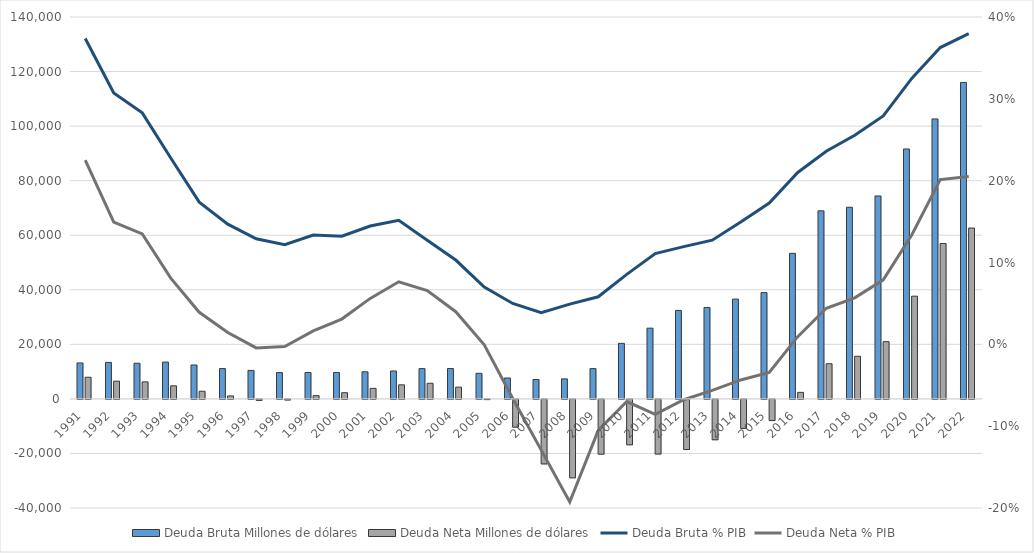
| Category | Deuda Bruta | Deuda Neta |
|---|---|---|
| 1991.0 | 13170 | 7929 |
| 1992.0 | 13385 | 6505 |
| 1993.0 | 13075 | 6238 |
| 1994.0 | 13498 | 4796 |
| 1995.0 | 12435 | 2803 |
| 1996.0 | 11117 | 1099 |
| 1997.0 | 10445 | -352 |
| 1998.0 | 9651 | -219 |
| 1999.0 | 9677 | 1186 |
| 2000.0 | 9690 | 2264 |
| 2001.0 | 9929 | 3856 |
| 2002.0 | 10228 | 5153 |
| 2003.0 | 11095 | 5727 |
| 2004.0 | 11126 | 4305 |
| 2005.0 | 9373 | -72 |
| 2006.0 | 7666 | -10176 |
| 2007.0 | 7094 | -23649 |
| 2008.0 | 7335 | -28745 |
| 2009.0 | 11096 | -20089 |
| 2010.0 | 20358 | -16651 |
| 2011.0 | 25928 | -20031 |
| 2012.0 | 32423 | -18387 |
| 2013.0 | 33515 | -14803 |
| 2014.0 | 36587 | -10642 |
| 2015.0 | 38963 | -7758 |
| 2016.0 | 53365 | 2390 |
| 2017.0 | 68936 | 12887 |
| 2018.0 | 70247 | 15629 |
| 2019.0 | 74391.192 | 20989.49 |
| 2020.0 | 91625.136 | 37655.193 |
| 2021.0 | 102631.904 | 56961.433 |
| 2022.0 | 116020.857 | 62641.9 |